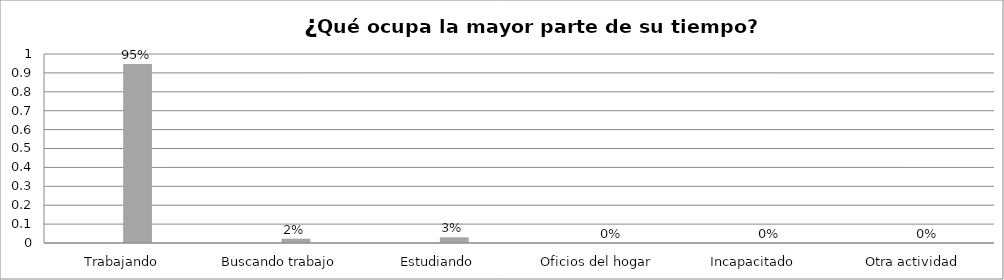
| Category | Series 0 | Series 1 | Series 2 | Series 3 |
|---|---|---|---|---|
| Trabajando |  |  | 0.947 |  |
| Buscando trabajo |  |  | 0.023 |  |
| Estudiando |  |  | 0.03 |  |
| Oficios del hogar |  |  | 0 |  |
| Incapacitado  |  |  | 0 |  |
| Otra actividad |  |  | 0 |  |